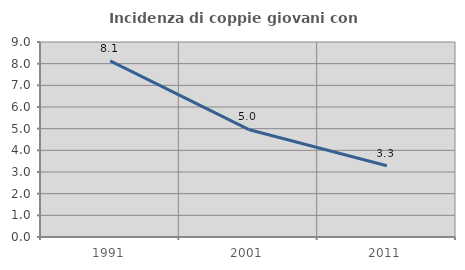
| Category | Incidenza di coppie giovani con figli |
|---|---|
| 1991.0 | 8.125 |
| 2001.0 | 4.965 |
| 2011.0 | 3.289 |